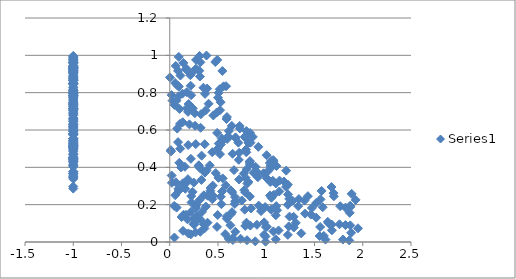
| Category | Series 0 |
|---|---|
| 0.8326904518869713 | 0.584 |
| 0.12277350922863572 | 0.134 |
| 0.172072388152531 | 0.923 |
| 0.0625908067737222 | 0.943 |
| 0.3002978176599511 | 0.406 |
| -1.0 | 0.517 |
| 0.09407018181314264 | 0.832 |
| -1.0 | 0.933 |
| 0.6512445555651296 | 0.473 |
| 0.6049195586419134 | 0.567 |
| -1.0 | 0.744 |
| -1.0 | 0.369 |
| -1.0 | 0.811 |
| -1.0 | 0.509 |
| 0.9884517737455705 | 0.187 |
| 0.7770127583088533 | 0.173 |
| 0.10261464469563708 | 0.713 |
| 0.13779690024078795 | 0.06 |
| 1.0999699913673218 | 0.314 |
| -1.0 | 0.703 |
| 0.22292119432342794 | 0.246 |
| 1.2050717037212513 | 0.295 |
| -1.0 | 0.529 |
| -1.0 | 0.649 |
| 0.11612259109109258 | 0.399 |
| -1.0 | 0.554 |
| -1.0 | 0.664 |
| 1.1031542670087517 | 0.192 |
| 0.18376382405885372 | 0.328 |
| -1.0 | 0.71 |
| 1.665934332620808 | 0.092 |
| 0.7156181073915315 | 0.44 |
| -1.0 | 0.96 |
| -1.0 | 0.602 |
| -1.0 | 0.555 |
| -1.0 | 0.431 |
| 1.233705783115666 | 0.084 |
| -1.0 | 0.511 |
| -1.0 | 0.775 |
| 1.5188814588469655 | 0.21 |
| -1.0 | 0.874 |
| 0.7668442158579054 | 0.366 |
| 1.2245679794921687 | 0.307 |
| 0.4400089561458882 | 0.481 |
| 0.3197960105518316 | 0.612 |
| 0.5928878291654713 | 0.67 |
| -1.0 | 0.612 |
| 0.8348708568412215 | 0.088 |
| 0.08104228305719441 | 0.838 |
| 0.7932902903066641 | 0.481 |
| -1.0 | 0.469 |
| 0.3011453200648442 | 0.411 |
| 0.7775847936660008 | 0.564 |
| -1.0 | 0.908 |
| 0.15717946028370045 | 0.403 |
| 0.4977733800061346 | 0.5 |
| 0.10596365607125446 | 0.633 |
| 0.5352530794874344 | 0.202 |
| -1.0 | 0.871 |
| -1.0 | 0.525 |
| -1.0 | 0.723 |
| -1.0 | 0.412 |
| 1.6803629888474854 | 0.063 |
| 0.1969602445826666 | 0.719 |
| -1.0 | 0.714 |
| 0.589360971469125 | 0.137 |
| -1.0 | 0.499 |
| 1.0790188830993686 | 0.253 |
| 0.26695649502909324 | 0.051 |
| 0.922080650480243 | 0.195 |
| 1.552834367719299 | 0.032 |
| 0.783722490832214 | 0.558 |
| 0.6793951073498306 | 0.055 |
| 0.31264386164271807 | 0.886 |
| 0.26949253345626545 | 0.525 |
| 0.3169827079967813 | 0.055 |
| 0.028474202414481287 | 0.757 |
| 0.6657941255980053 | 0.385 |
| -1.0 | 0.807 |
| 0.7266436417284443 | 0.608 |
| 0.6455242349216259 | 0.16 |
| 1.5174716836516244 | 0.131 |
| -1.0 | 0.505 |
| -1.0 | 0.993 |
| 0.546056798712901 | 0.542 |
| 0.5082427180430882 | 0.527 |
| 0.42147924757038546 | 0.275 |
| -1.0 | 0.338 |
| 0.3302023560272389 | 0.463 |
| 0.8162441767688597 | 0.531 |
| -1.0 | 0.92 |
| 0.3626347104348633 | 0.524 |
| -1.0 | 0.85 |
| -1.0 | 0.444 |
| 0.054933781458399 | 0.852 |
| 0.27271831911673505 | 0.976 |
| 0.32315128674919746 | 0.684 |
| 0.3918012412872147 | 0.104 |
| 0.8035316066517175 | 0.313 |
| 0.789085312707339 | 0.495 |
| 0.5747944999674601 | 0.042 |
| 1.223553888506987 | 0.199 |
| -1.0 | 0.9 |
| 1.8847418379940175 | 0.258 |
| 0.048528355755486974 | 0.024 |
| 0.3737544571988305 | 0.19 |
| -1.0 | 0.976 |
| -1.0 | 0.794 |
| -1.0 | 0.938 |
| -1.0 | 0.345 |
| -1.0 | 0.711 |
| -1.0 | 0.928 |
| -1.0 | 0.934 |
| -1.0 | 0.934 |
| -1.0 | 0.44 |
| 0.1894138957214444 | 0.697 |
| -1.0 | 0.785 |
| 0.9129314272110935 | 0.347 |
| -1.0 | 0.928 |
| 0.48794231384582787 | 0.694 |
| -1.0 | 0.507 |
| 1.0555851477748277 | 0.401 |
| 0.314213025589533 | 0.395 |
| -1.0 | 0.573 |
| 1.8211795050482333 | 0.091 |
| 0.307060914020741 | 0.224 |
| 0.011145298415055072 | 0.492 |
| 1.0990407538714462 | 0.144 |
| -1.0 | 0.617 |
| -1.0 | 0.408 |
| 0.612684034182114 | 0.595 |
| -1.0 | 0.867 |
| 0.18348445229566734 | 0.121 |
| 0.8611660108642623 | 0.563 |
| -1.0 | 0.795 |
| -1.0 | 0.956 |
| -1.0 | 0.938 |
| -1.0 | 0.962 |
| -1.0 | 0.353 |
| -1.0 | 0.455 |
| 0.3524405652770066 | 0.095 |
| 0.02221134450408635 | 0.317 |
| 0.6810948413440296 | 0.557 |
| 1.7009733260295716 | 0.245 |
| 0.5919653766630595 | 0.125 |
| 0.1429848663634663 | 0.146 |
| 0.06364666517280249 | 0.32 |
| 0.6353423421855409 | 0.15 |
| -1.0 | 0.794 |
| 0.019580303119771214 | 0.787 |
| -1.0 | 0.656 |
| 0.9035694837732267 | 0.092 |
| 0.5175919491553964 | 0.818 |
| 1.1842072475620424 | 0.324 |
| -1.0 | 0.748 |
| 1.1378193341855767 | 0.329 |
| -1.0 | 0.622 |
| 1.285469147243515 | 0.078 |
| -1.0 | 0.678 |
| 0.7829472361773293 | 0.266 |
| 0.677066483436408 | 0.24 |
| 1.431278491845432 | 0.246 |
| 1.5736495723540733 | 0.274 |
| 0.9781907512344568 | 0.105 |
| -1.0 | 0.963 |
| -1.0 | 0.931 |
| -1.0 | 0.866 |
| 0.7467458028876008 | 0.222 |
| 0.5063709270150929 | 0.799 |
| -1.0 | 0.451 |
| -1.0 | 0.947 |
| -1.0 | 0.622 |
| -1.0 | 0.523 |
| 0.6285016116300599 | 0.089 |
| -1.0 | 0.441 |
| 0.7824714482308 | 0.086 |
| 0.583496368083426 | 0.835 |
| 0.25977627116225066 | 0.69 |
| 1.2379254716824892 | 0.231 |
| -1.0 | 0.98 |
| 0.26955363010687927 | 0.184 |
| 0.8891627804421867 | 0.403 |
| 0.4898666208239908 | 0.081 |
| 0.0478295479604216 | 0.734 |
| -1.0 | 0.414 |
| 0.2038434221524712 | 0.63 |
| 0.7986385547816421 | 0.391 |
| 0.38745393819473484 | 0.822 |
| -1.0 | 0.97 |
| 0.4232297333142536 | 0.289 |
| -1.0 | 0.645 |
| 0.36562878580153235 | 0.794 |
| 0.2538194766396804 | 0.103 |
| 0.21327109314249748 | 0.893 |
| 0.1083262606800639 | 0.5 |
| 1.0985785524230747 | 0.015 |
| -1.0 | 0.814 |
| -1.0 | 0.884 |
| -1.0 | 0.454 |
| 0.06939519760724044 | 0.757 |
| 0.528874291136264 | 0.242 |
| 0.27076951840348285 | 0.928 |
| -1.0 | 0.766 |
| 1.2263834611782534 | 0.255 |
| -1.0 | 0.848 |
| -1.0 | 0.664 |
| -1.0 | 0.985 |
| -1.0 | 0.456 |
| 0.4141423568644309 | 0.411 |
| 0.07722497876386392 | 0.608 |
| 1.0738634247148302 | 0.057 |
| -1.0 | 0.917 |
| -1.0 | 0.776 |
| 0.8704688446446218 | 0.372 |
| 0.45188469585570634 | 0.678 |
| 0.9182184643783613 | 0.51 |
| -1.0 | 0.922 |
| -1.0 | 0.74 |
| 0.8301416923054137 | 0.244 |
| 0.2732260984171131 | 0.196 |
| 1.5965342287668025 | 0.033 |
| 0.7184744327162962 | 0.335 |
| 1.5619437552880169 | 0.229 |
| -1.0 | 0.846 |
| -1.0 | 0.962 |
| 1.0676800047265318 | 0.328 |
| -1.0 | 0.578 |
| -1.0 | 0.436 |
| -1.0 | 0.519 |
| 0.17567290728308316 | 0.802 |
| 1.6469789595328157 | 0.1 |
| -1.0 | 0.814 |
| 0.7199582235845423 | 0.478 |
| -1.0 | 0.472 |
| -1.0 | 0.802 |
| 0.6533630763287908 | 0.021 |
| -1.0 | 0.379 |
| 1.2738395700872078 | 0.221 |
| -1.0 | 0.491 |
| 0.21941472665524242 | 0.161 |
| 1.8710852092559018 | 0.089 |
| 0.9717962794932873 | 0.368 |
| 1.697257007692161 | 0.262 |
| -1.0 | 0.529 |
| -1.0 | 0.576 |
| 0.24943326000191757 | 0.126 |
| 0.6347084800509843 | 0.276 |
| -1.0 | 0.783 |
| -1.0 | 0.511 |
| 1.3306368122861172 | 0.192 |
| -1.0 | 0.877 |
| 0.36408096599393325 | 0.372 |
| 1.3379768176755622 | 0.23 |
| 0.7248234798360103 | 0.622 |
| -1.0 | 0.901 |
| 0.5272564405117259 | 0.749 |
| -1.0 | 0.874 |
| 1.0367589813180536 | 0.423 |
| -1.0 | 0.914 |
| 0.9777978135796486 | 0.039 |
| 0.6738877447716507 | 0.204 |
| -1.0 | 0.555 |
| 0.16280251531021328 | 0.313 |
| -1.0 | 0.402 |
| 1.1061257223068488 | 0.407 |
| 0.3278953941428042 | 0.332 |
| 0.44572878420010476 | 0.302 |
| 1.2836886276667154 | 0.135 |
| 0.171776039062717 | 0.929 |
| 1.3966400262316279 | 0.222 |
| 1.041610831528787 | 0.321 |
| 1.6137646842130524 | 0.013 |
| 0.7858102521818158 | 0.344 |
| 1.0035238269598548 | 0.465 |
| 0.2823343253710999 | 0.139 |
| -1.0 | 0.914 |
| -1.0 | 0.484 |
| -1.0 | 0.545 |
| 1.362745095513452 | 0.046 |
| 0.218765345846049 | 0.446 |
| -1.0 | 0.541 |
| 0.13473944107516234 | 0.315 |
| 1.0066589230499539 | 0.081 |
| -1.0 | 0.891 |
| 0.5290410165933559 | 0.522 |
| -1.0 | 0.888 |
| -1.0 | 0.749 |
| 0.19114760751268767 | 0.519 |
| -1.0 | 0.58 |
| 0.3922826180623067 | 0.248 |
| 0.7336381905354747 | 0.017 |
| 0.18812314476104341 | 0.337 |
| 1.306141915532451 | 0.102 |
| 0.5952296310467611 | 0.552 |
| 0.5888507012570392 | 0.659 |
| -1.0 | 0.631 |
| 1.821526278811617 | 0.184 |
| -1.0 | 0.944 |
| 0.49233610582225973 | 0.975 |
| -1.0 | 0.54 |
| 0.371629989815651 | 0.705 |
| 0.22776285615942649 | 0.904 |
| 1.6376781891459231 | 0.108 |
| 1.043868128753088 | 0.407 |
| 0.175594360910041 | 0.716 |
| 1.1354739674487235 | 0.271 |
| 0.3175700101330672 | 0.963 |
| -1.0 | 0.716 |
| -1.0 | 0.849 |
| 0.1611288173793164 | 0.285 |
| -1.0 | 0.797 |
| 0.8285632345826495 | 0.429 |
| 1.7665103328944367 | 0.192 |
| -1.0 | 0.368 |
| 0.13130984887932007 | 0.795 |
| 1.865280463181459 | 0.157 |
| 0.8313554018048934 | 0.433 |
| -1.0 | 0.513 |
| 0.09860530918361166 | 0.424 |
| -1.0 | 0.446 |
| 1.5851405355040007 | 0.186 |
| -1.0 | 0.73 |
| 0.09216497865935747 | 0.78 |
| -1.0 | 0.367 |
| -1.0 | 0.629 |
| -1.0 | 0.825 |
| -1.0 | 0.851 |
| -1.0 | 0.935 |
| 0.38150193813301647 | 0.383 |
| -1.0 | 0.786 |
| 0.841336550094395 | 0.18 |
| 1.9504622119453376 | 0.073 |
| 0.01345752642426934 | 0.486 |
| 0.7718530340803873 | 0.278 |
| 0.5007349748510113 | 0.773 |
| -1.0 | 0.425 |
| -1.0 | 0.744 |
| 0.3806629755593405 | 0.999 |
| 0.6429151154998523 | 0.622 |
| 0.4769602929479324 | 0.369 |
| 1.6785836043715647 | 0.094 |
| -1.0 | 0.737 |
| -1.0 | 0.907 |
| 0.3162158091810747 | 0.122 |
| 0.30655361903855605 | 0.918 |
| 0.541510641584646 | 0.271 |
| -1.0 | 0.736 |
| 1.9258950356180018 | 0.225 |
| -1.0 | 0.688 |
| 0.21801510651629874 | 0.041 |
| 0.22203644249339383 | 0.786 |
| 0.09188960345854458 | 0.273 |
| -1.0 | 0.935 |
| 1.0508153826639166 | 0.434 |
| -1.0 | 0.963 |
| 0.020067373997932902 | 0.356 |
| 1.872489930590702 | 0.189 |
| 1.7590250592142216 | 0.095 |
| 0.25492307280967497 | 0.094 |
| 0.8369033275136506 | 0.532 |
| 0.19542827808522567 | 0.739 |
| 1.1274033266379 | 0.062 |
| 0.3594389533487312 | 0.072 |
| 0.5381328573272202 | 0.555 |
| -1.0 | 0.922 |
| -1.0 | 0.376 |
| -1.0 | 0.989 |
| -1.0 | 0.931 |
| 0.9964934451645269 | 0.08 |
| 0.3089631818570564 | 0.997 |
| -1.0 | 0.647 |
| 1.675945377141894 | 0.295 |
| -1.0 | 0.793 |
| -1.0 | 0.866 |
| 1.4020833949929479 | 0.152 |
| -1.0 | 0.881 |
| 0.5577166748296036 | 0.834 |
| -1.0 | 0.66 |
| -1.0 | 0.715 |
| -1.0 | 0.724 |
| -1.0 | 0.75 |
| 1.2418036254328009 | 0.136 |
| -1.0 | 0.349 |
| -1.0 | 0.941 |
| -1.0 | 0.804 |
| 0.04612363498307581 | 0.193 |
| -1.0 | 0.852 |
| 0.6539038778440667 | 0.011 |
| 0.334429722942883 | 0.161 |
| 0.4721264393381075 | 0.964 |
| 1.8596618275001615 | 0.009 |
| 1.0486847554167382 | 0.173 |
| 0.8762061260146157 | 0.368 |
| -1.0 | 0.616 |
| 1.0716722674110886 | 0.439 |
| 0.23925776805323884 | 0.716 |
| 0.2372716193025457 | 0.268 |
| 0.21651457926823015 | 0.837 |
| -1.0 | 0.795 |
| 0.4022811467057832 | 0.741 |
| 0.4408707182797842 | 0.229 |
| 0.520635242878438 | 0.471 |
| 0.904658726998486 | 0.375 |
| 0.5449992325209536 | 0.916 |
| 0.6108860192887546 | 0.017 |
| 0.07156723164096279 | 0.184 |
| 0.3540124281720951 | 0.25 |
| -1.0 | 0.286 |
| -1.0 | 0.844 |
| -1.0 | 0.544 |
| -1.0 | 0.918 |
| 0.647252845113395 | 0.267 |
| 0.7935512785549166 | 0.595 |
| 1.2065278707629863 | 0.382 |
| 0.08583042140317931 | 0.917 |
| -1.0 | 0.429 |
| 0.26192743485289394 | 0.623 |
| 1.0757451622107466 | 0.433 |
| -1.0 | 0.497 |
| -1.0 | 0.359 |
| -1.0 | 0.977 |
| -1.0 | 0.997 |
| -1.0 | 0.83 |
| 0.14096258753502977 | 0.959 |
| 1.8693080723355917 | 0.194 |
| 1.794578375781289 | 0.013 |
| 0.9462165011802517 | 0.165 |
| 0.05655820914272436 | 0.251 |
| -1.0 | 0.702 |
| 0.7949359951205048 | 0.104 |
| -1.0 | 0.599 |
| 1.8797160054177018 | 0.049 |
| -1.0 | 0.468 |
| 1.0540372313296993 | 0.237 |
| 0.9921181993451069 | 0.03 |
| 0.579688228889758 | 0.303 |
| -1.0 | 0.636 |
| -1.0 | 0.923 |
| -1.0 | 0.91 |
| -1.0 | 0.58 |
| 0.677798678457163 | 0.219 |
| 0.08946917773256646 | 0.285 |
| 0.8144347808626926 | 0.322 |
| 0.16886237583716723 | 0.146 |
| -1.0 | 0.578 |
| -1.0 | 0.606 |
| 1.4724940347725883 | 0.182 |
| 0.8298030564539374 | 0.418 |
| 0.6818151377573485 | 0.56 |
| -1.0 | 0.533 |
| 1.0395495486598016 | 0.249 |
| 0.8005917650100145 | 0.009 |
| -1.0 | 0.814 |
| 0.3488435553878366 | 0.827 |
| 1.005977051811037 | 0.341 |
| -1.0 | 0.864 |
| 0.1932146919081963 | 0.046 |
| 0.08644605873523403 | 0.535 |
| 0.49097407407337856 | 0.585 |
| 0.5045939515909224 | 0.344 |
| -1.0 | 0.446 |
| 0.1343776229376139 | 0.641 |
| 0.24930649657198933 | 0.318 |
| -1.0 | 0.759 |
| -1.0 | 0.446 |
| -1.0 | 0.935 |
| -1.0 | 0.78 |
| -1.0 | 0.726 |
| 0.22520045368573238 | 0.212 |
| -1.0 | 0.591 |
| 0.521144425866064 | 0.706 |
| -1.0 | 0.692 |
| -1.0 | 0.297 |
| 0.2467982136348501 | 0.095 |
| -1.0 | 0.501 |
| 0.4971506163679307 | 0.145 |
| -1.0 | 0.766 |
| 0.9931630739321884 | 0.002 |
| -1.0 | 0.581 |
| -1.0 | 0.685 |
| 1.5589276740799565 | 0.081 |
| 0.548637397897979 | 0.341 |
| 1.1119324333393894 | 0.17 |
| 0.44764538427001566 | 0.248 |
| -1.0 | 0.551 |
| 0.0014671270645914003 | 0.882 |
| -1.0 | 0.784 |
| -1.0 | 0.966 |
| 0.09331273426444553 | 0.992 |
| -1.0 | 0.785 |
| -1.0 | 0.591 |
| 1.4626483958907026 | 0.147 |
| 0.11078975068001928 | 0.892 |
| 0.8863923951535786 | 0.004 |
| -1.0 | 0.517 |
| 1.0131443251901215 | 0.378 |
| -1.0 | 0.716 |
| 0.7111528635581295 | 0.532 |
| 1.2237909149380544 | 0.038 |